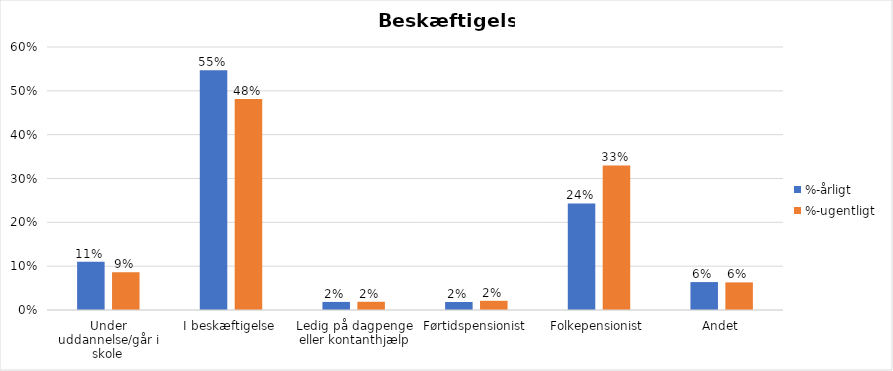
| Category | %-årligt | %-ugentligt |
|---|---|---|
| Under uddannelse/går i skole | 0.11 | 0.086 |
| I beskæftigelse | 0.547 | 0.481 |
| Ledig på dagpenge eller kontanthjælp | 0.018 | 0.019 |
| Førtidspensionist | 0.018 | 0.021 |
| Folkepensionist | 0.243 | 0.33 |
| Andet | 0.064 | 0.063 |